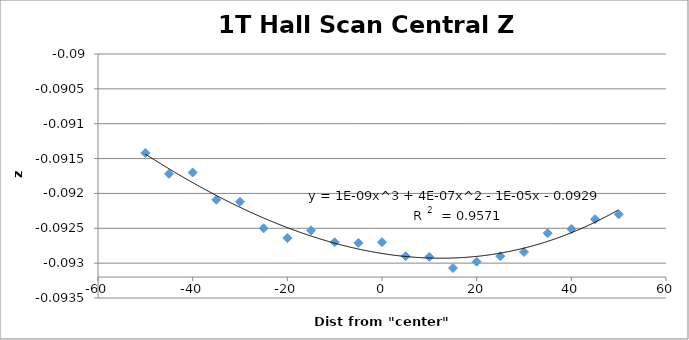
| Category | Series 0 |
|---|---|
| -50.0 | -0.091 |
| -45.0 | -0.092 |
| -40.0 | -0.092 |
| -35.0 | -0.092 |
| -30.0 | -0.092 |
| -25.0 | -0.092 |
| -20.0 | -0.093 |
| -15.0 | -0.093 |
| -10.0 | -0.093 |
| -5.0 | -0.093 |
| 0.0 | -0.093 |
| 5.0 | -0.093 |
| 10.0 | -0.093 |
| 15.0 | -0.093 |
| 20.0 | -0.093 |
| 25.0 | -0.093 |
| 30.0 | -0.093 |
| 35.0 | -0.093 |
| 40.0 | -0.093 |
| 45.0 | -0.092 |
| 50.0 | -0.092 |